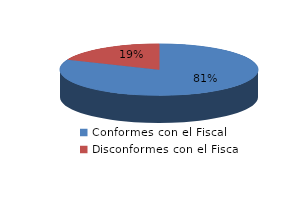
| Category | Series 0 |
|---|---|
| 0 | 2145 |
| 1 | 492 |